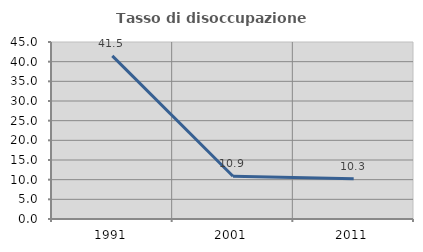
| Category | Tasso di disoccupazione giovanile  |
|---|---|
| 1991.0 | 41.463 |
| 2001.0 | 10.87 |
| 2011.0 | 10.256 |